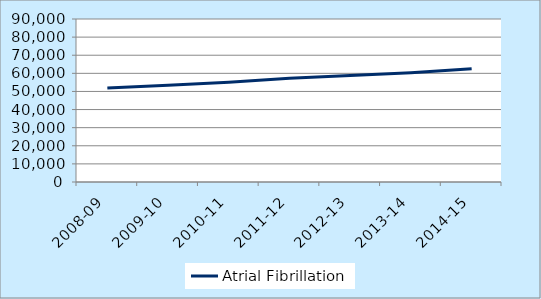
| Category | Atrial Fibrillation |
|---|---|
| 2008-09 | 51963 |
| 2009-10 | 53403 |
| 2010-11 | 55036 |
| 2011-12 | 57299 |
| 2012-13 | 58787 |
| 2013-14 | 60348 |
| 2014-15 | 62595 |